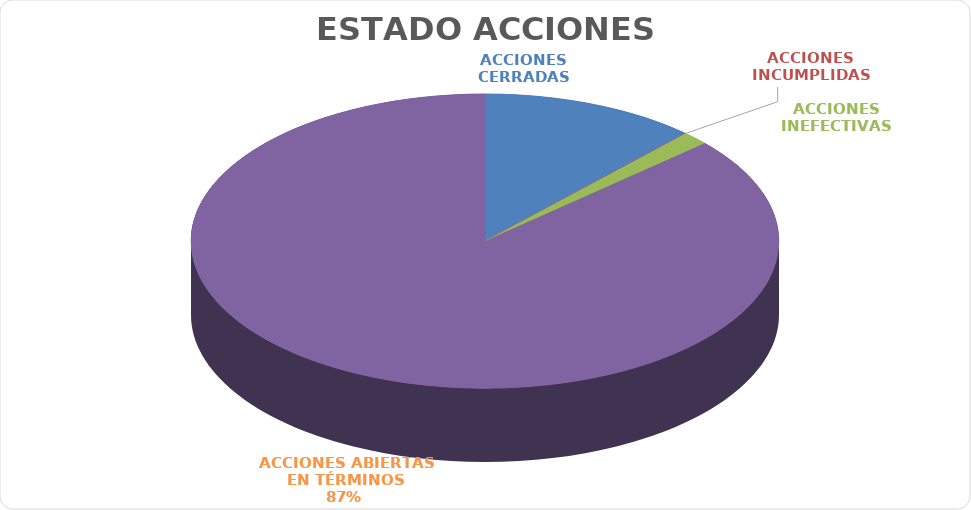
| Category | Series 0 |
|---|---|
| ACCIONES CERRADAS | 16 |
| ACCIONES INCUMPLIDAS | 0 |
| ACCIONES INEFECTIVAS | 2 |
| ACCIONES ABIERTAS EN TÉRMINOS | 116 |